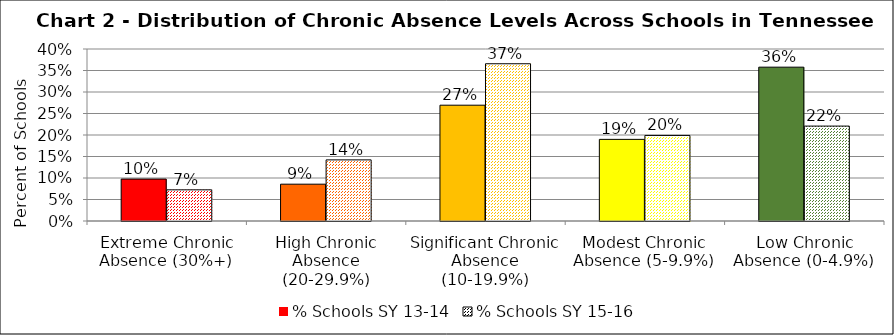
| Category | % Schools SY 13-14 | % Schools SY 15-16 |
|---|---|---|
| Extreme Chronic Absence (30%+) | 0.097 | 0.072 |
| High Chronic Absence (20-29.9%) | 0.086 | 0.142 |
| Significant Chronic Absence (10-19.9%) | 0.269 | 0.366 |
| Modest Chronic Absence (5-9.9%) | 0.19 | 0.199 |
| Low Chronic Absence (0-4.9%) | 0.358 | 0.221 |